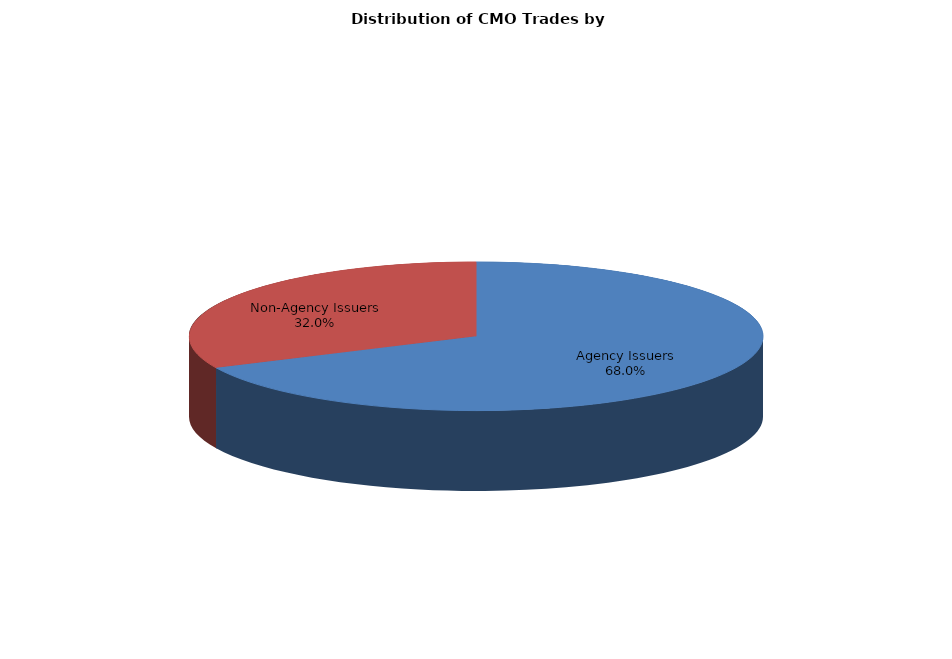
| Category | Series 0 |
|---|---|
| Agency Issuers | 984.563 |
| Non-Agency Issuers | 463.032 |